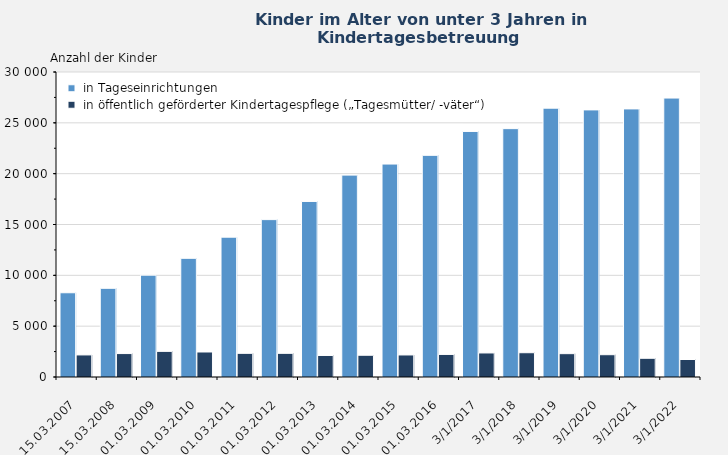
| Category |  in Tageseinrichtungen |  in öffentlich geförderter Kindertagespflege („Tagesmütter/ -väter“) |
|---|---|---|
| 15.03.2007 | 8286 | 2171 |
| 15.03.2008 | 8723 | 2304 |
| 01.03.2009 | 10017 | 2521 |
| 01.03.2010 | 11673 | 2460 |
| 01.03.2011 | 13753 | 2328 |
| 01.03.2012 | 15480 | 2327 |
| 01.03.2013 | 17266 | 2117 |
| 01.03.2014 | 19857 | 2138 |
| 01.03.2015 | 20945 | 2168 |
| 01.03.2016 | 21803 | 2219 |
| 01.03.2017 | 24153 | 2365 |
| 01.03.2018 | 24428 | 2387 |
| 01.03.2019 | 26442 | 2296 |
| 01.03.2020 | 26273 | 2192 |
| 01.03.2021 | 26369 | 1840 |
| 01.03.2022 | 27438 | 1721 |